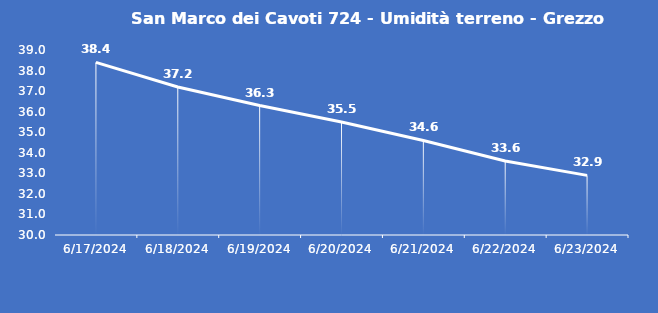
| Category | San Marco dei Cavoti 724 - Umidità terreno - Grezzo (%VWC) |
|---|---|
| 6/17/24 | 38.4 |
| 6/18/24 | 37.2 |
| 6/19/24 | 36.3 |
| 6/20/24 | 35.5 |
| 6/21/24 | 34.6 |
| 6/22/24 | 33.6 |
| 6/23/24 | 32.9 |